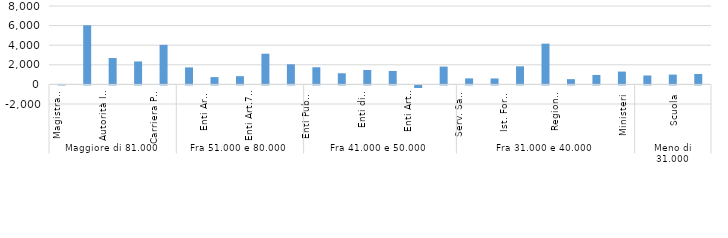
| Category | Series 0 |
|---|---|
| 0 | 47.481 |
| 1 | 6037.046 |
| 2 | 2690.232 |
| 3 | 2340.46 |
| 4 | 4035.273 |
| 5 | 1736.999 |
| 6 | 744.137 |
| 7 | 837.938 |
| 8 | 3129.872 |
| 9 | 2052.955 |
| 10 | 1750.365 |
| 11 | 1136.959 |
| 12 | 1469.368 |
| 13 | 1372.499 |
| 14 | -266.424 |
| 15 | 1816.891 |
| 16 | 614.425 |
| 17 | 608.709 |
| 18 | 1843.966 |
| 19 | 4157.364 |
| 20 | 535.895 |
| 21 | 964.715 |
| 22 | 1308.692 |
| 23 | 910.429 |
| 24 | 1000.13 |
| 25 | 1063.229 |